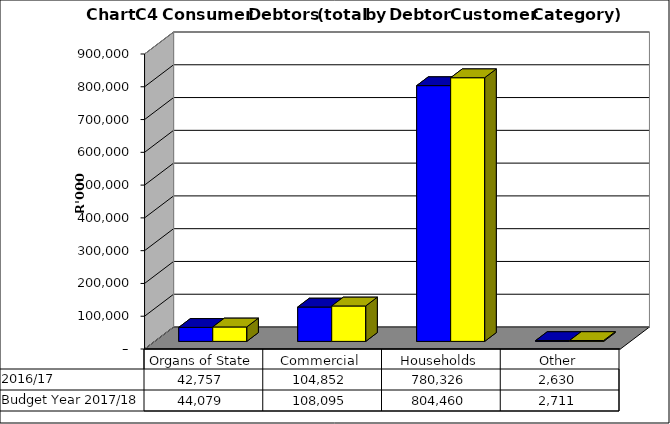
| Category |  2016/17  | Budget Year 2017/18 |
|---|---|---|
| Organs of State | 42756919.235 | 44079298.18 |
| Commercial | 104852311.311 | 108095166.3 |
| Households | 780326435.497 | 804460242.78 |
| Other | 2629584.95 | 2710912.32 |